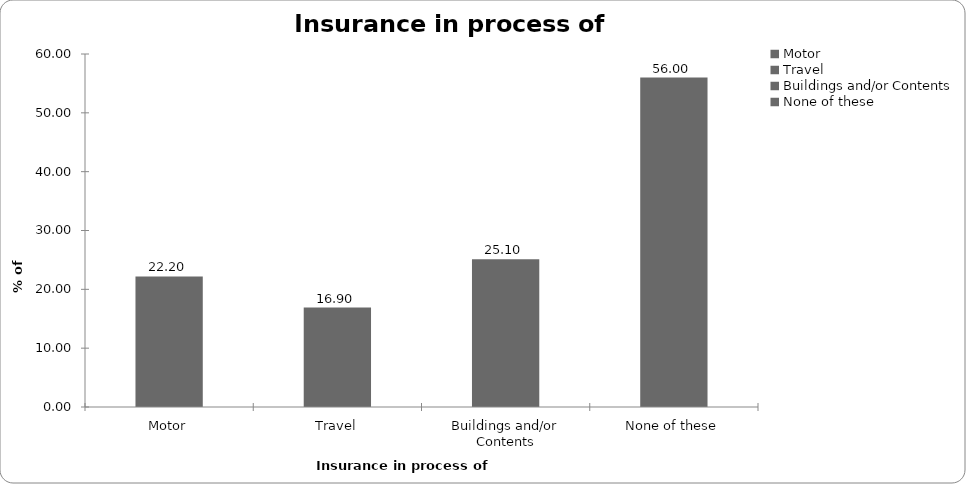
| Category | Insurance in process of buying |
|---|---|
| Motor | 22.2 |
| Travel | 16.9 |
| Buildings and/or Contents | 25.1 |
| None of these | 56 |